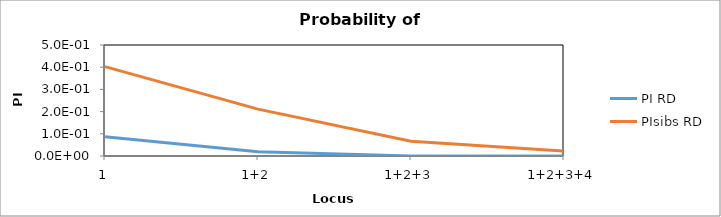
| Category | PI RD | PIsibs RD |
|---|---|---|
| 1 | 0.087 | 0.403 |
| 1+2 | 0.019 | 0.211 |
| 1+2+3 | 0 | 0.067 |
| 1+2+3+4 | 0 | 0.022 |